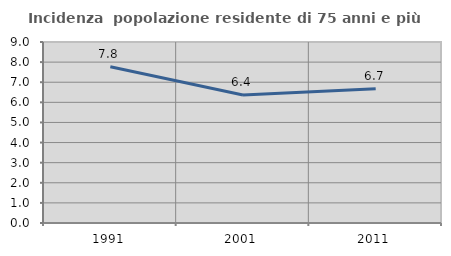
| Category | Incidenza  popolazione residente di 75 anni e più |
|---|---|
| 1991.0 | 7.768 |
| 2001.0 | 6.366 |
| 2011.0 | 6.673 |